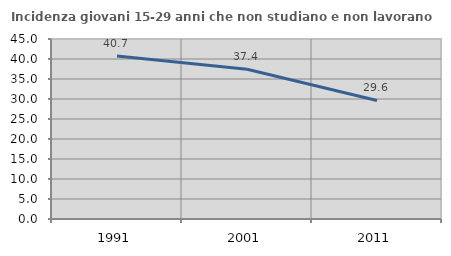
| Category | Incidenza giovani 15-29 anni che non studiano e non lavorano  |
|---|---|
| 1991.0 | 40.75 |
| 2001.0 | 37.43 |
| 2011.0 | 29.635 |